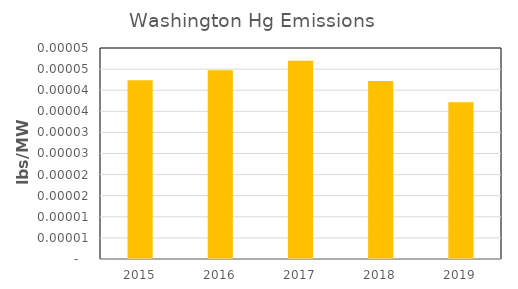
| Category | Series 0 |
|---|---|
| 2015.0 | 0 |
| 2016.0 | 0 |
| 2017.0 | 0 |
| 2018.0 | 0 |
| 2019.0 | 0 |